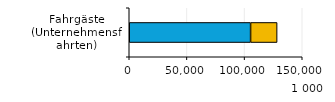
| Category | Öffentliche Unternehmen | Private und gemischtwirtschaftliche Unternehmen |
|---|---|---|
| 0 | 105210 | 22995 |